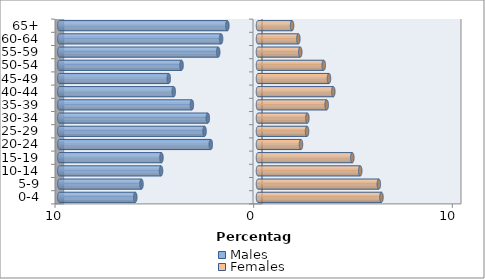
| Category | Males | Females |
|---|---|---|
| 0-4 | -6.177 | 6.214 |
| 5-9 | -5.867 | 6.082 |
| 10-14 | -4.881 | 5.146 |
| 15-19 | -4.86 | 4.747 |
| 20-24 | -2.376 | 2.163 |
| 25-29 | -2.69 | 2.47 |
| 30-34 | -2.526 | 2.485 |
| 35-39 | -3.328 | 3.458 |
| 40-44 | -4.241 | 3.791 |
| 45-49 | -4.492 | 3.573 |
| 50-54 | -3.848 | 3.309 |
| 55-59 | -2.003 | 2.127 |
| 60-64 | -1.858 | 2.031 |
| 65+ | -1.542 | 1.715 |